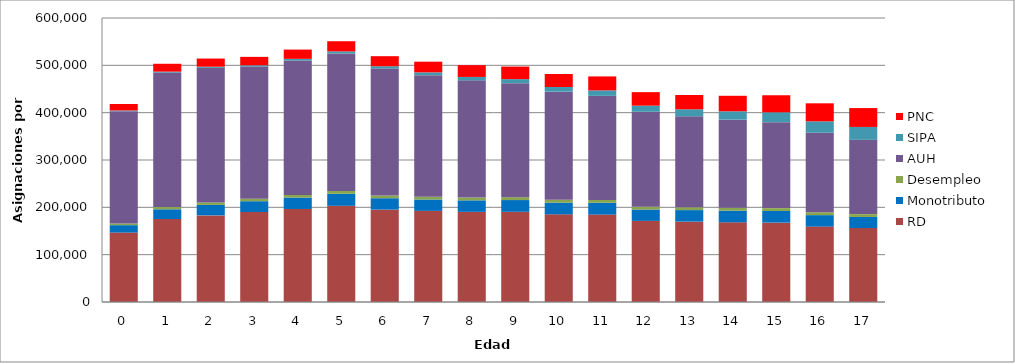
| Category | RD | Monotributo | Desempleo | AUH | SIPA | PNC |
|---|---|---|---|---|---|---|
| 0.0 | 146670 | 15673 | 3520 | 237164 | 1638 | 13701 |
| 1.0 | 175394 | 20448 | 5124 | 283713 | 2055 | 16569 |
| 2.0 | 183007 | 22074 | 5218 | 284372 | 2416 | 17242 |
| 3.0 | 190116 | 22835 | 5258 | 279144 | 2703 | 17834 |
| 4.0 | 196551 | 24177 | 5524 | 283865 | 3584 | 19601 |
| 5.0 | 203264 | 25320 | 5998 | 290503 | 4353 | 21511 |
| 6.0 | 195095 | 24188 | 5698 | 268127 | 4939 | 21280 |
| 7.0 | 192553 | 24011 | 5814 | 256894 | 5866 | 22568 |
| 8.0 | 190401 | 24395 | 5857 | 247648 | 7180 | 24937 |
| 9.0 | 190547 | 24828 | 6032 | 240954 | 8531 | 26523 |
| 10.0 | 185190 | 24710 | 6051 | 228412 | 9842 | 27437 |
| 11.0 | 184635 | 24943 | 6139 | 219743 | 11614 | 29497 |
| 12.0 | 171414 | 23948 | 5957 | 200606 | 12867 | 28562 |
| 13.0 | 169768 | 24405 | 5877 | 192215 | 14838 | 30192 |
| 14.0 | 168275 | 24705 | 6024 | 186207 | 17678 | 32772 |
| 15.0 | 167632 | 24693 | 6016 | 181629 | 20783 | 36017 |
| 16.0 | 159270 | 24255 | 6072 | 168031 | 24022 | 38108 |
| 17.0 | 156147 | 23514 | 6001 | 156967 | 27215 | 39867 |